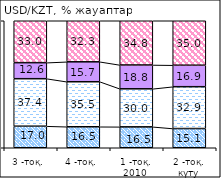
| Category | Көтеріледі | өзгермейді | снизится | білмеймін |
|---|---|---|---|---|
| 3 -тоқ. | 16.97 | 37.4 | 12.63 | 33 |
| 4 -тоқ. | 16.53 | 35.45 | 15.69 | 32.33 |
| 1 -тоқ. 2010  | 16.46 | 29.95 | 18.77 | 34.82 |
| 2 -тоқ. күту | 15.13 | 32.94 | 16.91 | 35.01 |